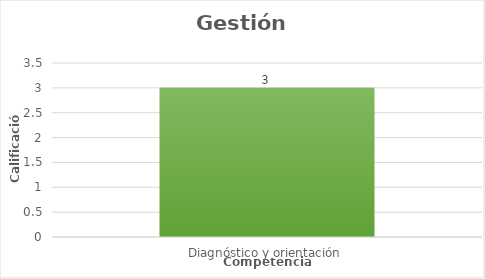
| Category | Series 0 |
|---|---|
| Diagnóstico y orientación | 3 |